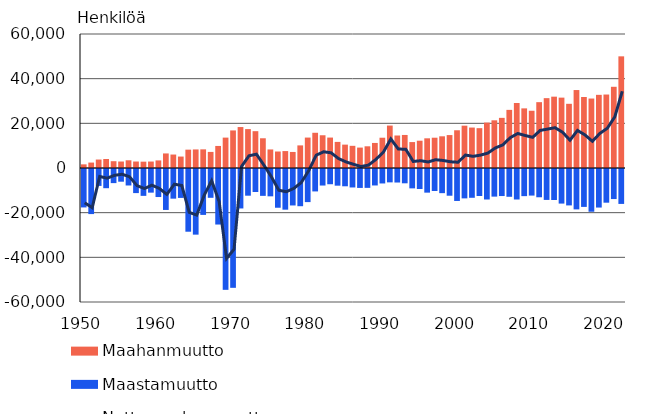
| Category | Maahanmuutto | Maastamuutto |
|---|---|---|
| 1950.0 | 1634 | -17211 |
| 1951.0 | 2432 | -20185 |
| 1952.0 | 3787 | -7576 |
| 1953.0 | 4037 | -8597 |
| 1954.0 | 3045 | -6320 |
| 1955.0 | 2900 | -5687 |
| 1956.0 | 3457 | -7379 |
| 1957.0 | 2901 | -10787 |
| 1958.0 | 2834 | -12025 |
| 1959.0 | 2893 | -10587 |
| 1960.0 | 3396 | -12552 |
| 1961.0 | 6521 | -18336 |
| 1962.0 | 6026 | -13280 |
| 1963.0 | 5127 | -12947 |
| 1964.0 | 8214 | -28082 |
| 1965.0 | 8311 | -29394 |
| 1966.0 | 8351 | -20554 |
| 1967.0 | 7202 | -12898 |
| 1968.0 | 9872 | -24866 |
| 1969.0 | 13608 | -54107 |
| 1970.0 | 16824 | -53205 |
| 1971.0 | 18338 | -17665 |
| 1972.0 | 17421 | -11951 |
| 1973.0 | 16491 | -10309 |
| 1974.0 | 13311 | -12027 |
| 1975.0 | 8307 | -12237 |
| 1976.0 | 7387 | -17346 |
| 1977.0 | 7580 | -18209 |
| 1978.0 | 7184 | -16327 |
| 1979.0 | 10122 | -16661 |
| 1980.0 | 13626 | -14824 |
| 1981.0 | 15771 | -10042 |
| 1982.0 | 14661 | -7403 |
| 1983.0 | 13629 | -6822 |
| 1984.0 | 11686 | -7467 |
| 1985.0 | 10465 | -7739 |
| 1986.0 | 9927 | -8269 |
| 1987.0 | 9142 | -8475 |
| 1988.0 | 9720 | -8447 |
| 1989.0 | 11219 | -7374 |
| 1990.0 | 13558 | -6477 |
| 1991.0 | 19001 | -5984 |
| 1992.0 | 14554 | -6055 |
| 1993.0 | 14795 | -6405 |
| 1994.0 | 11611 | -8672 |
| 1995.0 | 12222 | -8957 |
| 1996.0 | 13294 | -10587 |
| 1997.0 | 13564 | -9854 |
| 1998.0 | 14192 | -10817 |
| 1999.0 | 14744 | -11966 |
| 2000.0 | 16895 | -14311 |
| 2001.0 | 18955 | -13153 |
| 2002.0 | 18112 | -12891 |
| 2003.0 | 17838 | -12083 |
| 2004.0 | 20333 | -13656 |
| 2005.0 | 21355 | -12369 |
| 2006.0 | 22451 | -12107 |
| 2007.0 | 26029 | -12443 |
| 2008.0 | 29114 | -13657 |
| 2009.0 | 26699 | -12151 |
| 2010.0 | 25636 | -11905 |
| 2011.0 | 29481 | -12660 |
| 2012.0 | 31278 | -13845 |
| 2013.0 | 31941 | -13893 |
| 2014.0 | 31507 | -15486 |
| 2015.0 | 28746 | -16305 |
| 2016.0 | 34905 | -18082 |
| 2017.0 | 31797 | -16973 |
| 2018.0 | 31106 | -19141 |
| 2019.0 | 32758 | -17263 |
| 2020.0 | 32898 | -15084 |
| 2021.0 | 36364 | -13459 |
| 2022.0 | 49998 | -15635 |